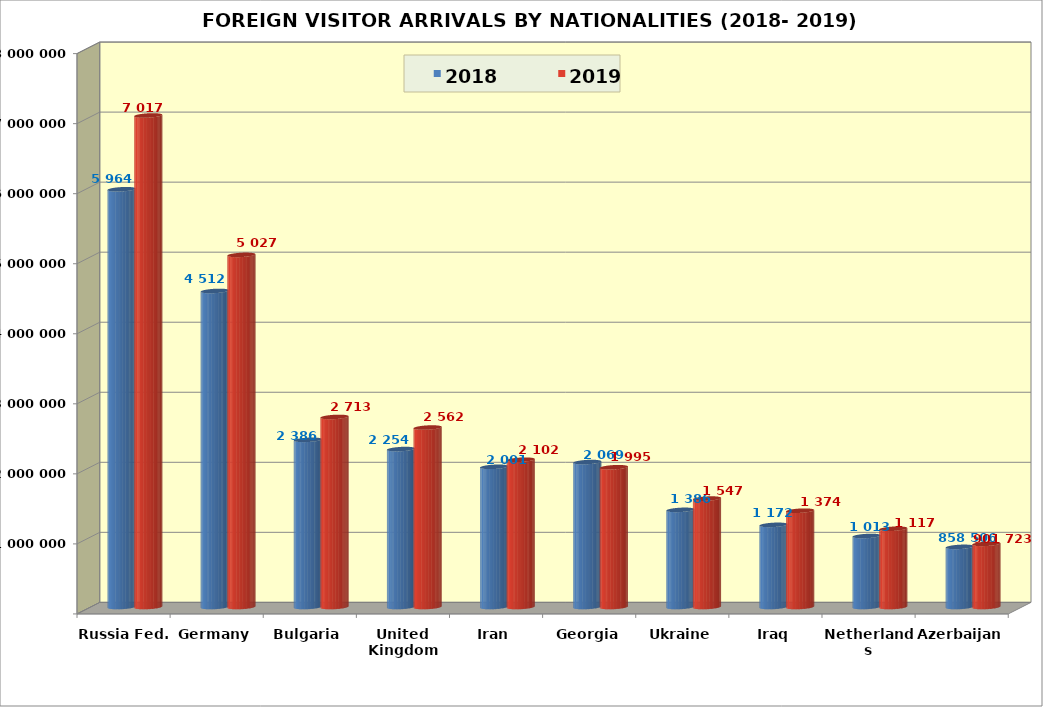
| Category | 2018 | 2019 |
|---|---|---|
| Russia Fed. | 5964613 | 7017657 |
| Germany | 4512360 | 5027472 |
| Bulgaria | 2386885 | 2713464 |
| United Kingdom (UK) | 2254871 | 2562064 |
| Iran | 2001744 | 2102890 |
| Georgia | 2069392 | 1995254 |
| Ukraine | 1386934 | 1547996 |
| Iraq | 1172896 | 1374896 |
| Netherlands | 1013642 | 1117290 |
| Azerbaijan | 858506 | 901723 |